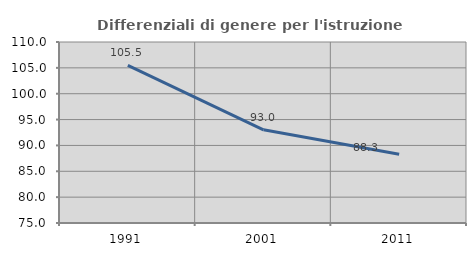
| Category | Differenziali di genere per l'istruzione superiore |
|---|---|
| 1991.0 | 105.488 |
| 2001.0 | 93.016 |
| 2011.0 | 88.295 |